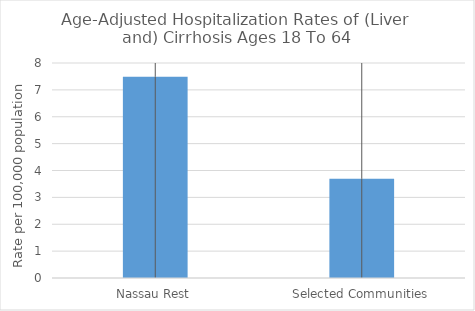
| Category | Age-Adjusted Hospitalization Rates of (Liver and) Cirrhosis Ages 18 To 64 |
|---|---|
| Nassau Rest | 7.491 |
| Selected Communities | 3.695 |